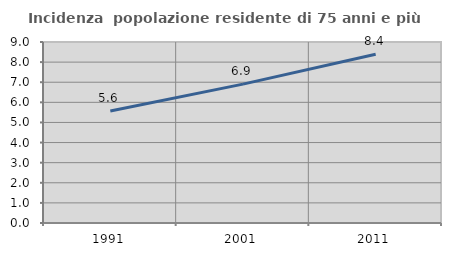
| Category | Incidenza  popolazione residente di 75 anni e più |
|---|---|
| 1991.0 | 5.573 |
| 2001.0 | 6.907 |
| 2011.0 | 8.389 |